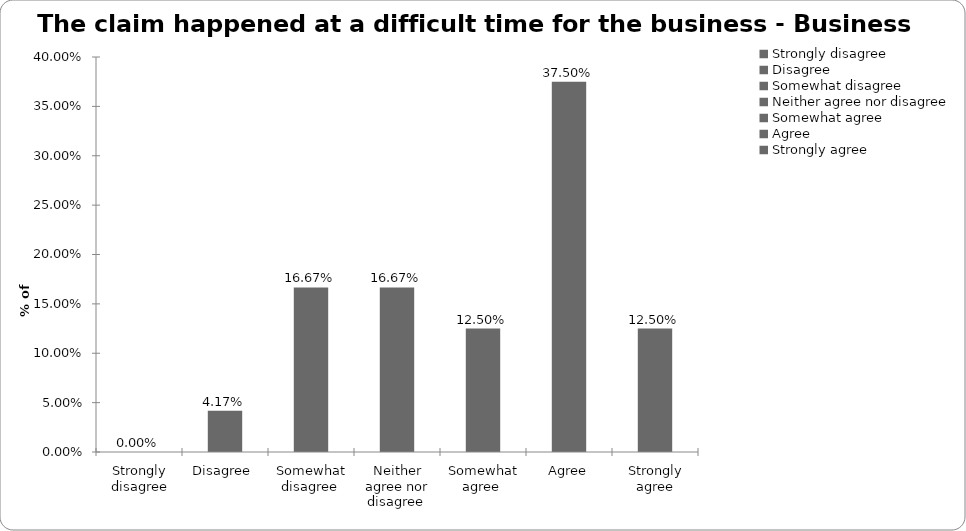
| Category | Series 0 |
|---|---|
| Strongly disagree | 0 |
| Disagree  | 0.042 |
| Somewhat disagree  | 0.167 |
| Neither agree nor disagree  | 0.167 |
| Somewhat agree  | 0.125 |
| Agree | 0.375 |
| Strongly agree | 0.125 |